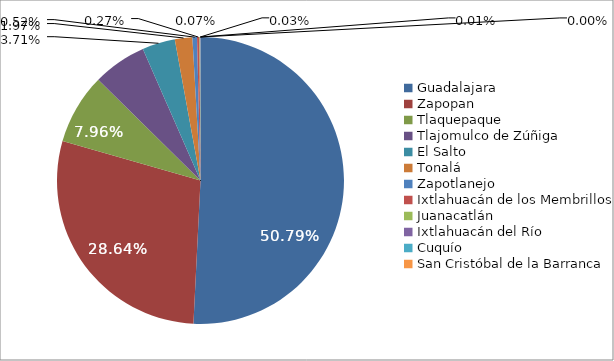
| Category | Series 0 |
|---|---|
| Guadalajara | 713156 |
| Zapopan | 402197 |
| Tlaquepaque | 111740 |
| Tlajomulco de Zúñiga | 84788 |
| El Salto | 52036 |
| Tonalá | 27703 |
| Zapotlanejo | 7233 |
| Ixtlahuacán de los Membrillos | 3756 |
| Juanacatlán | 1001 |
| Ixtlahuacán del Río | 462 |
| Cuquío | 162 |
| San Cristóbal de la Barranca | 27 |